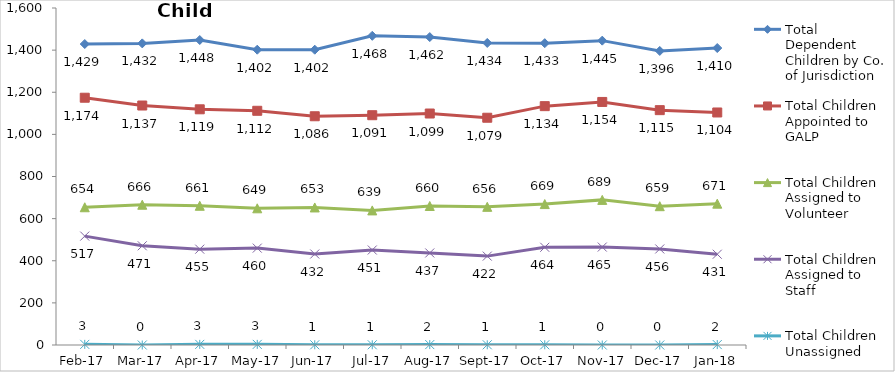
| Category | Total Dependent Children by Co. of Jurisdiction | Total Children Appointed to GALP | Total Children Assigned to Volunteer | Total Children Assigned to Staff | Total Children Unassigned |
|---|---|---|---|---|---|
| 2017-02-01 | 1429 | 1174 | 654 | 517 | 3 |
| 2017-03-01 | 1432 | 1137 | 666 | 471 | 0 |
| 2017-04-01 | 1448 | 1119 | 661 | 455 | 3 |
| 2017-05-01 | 1402 | 1112 | 649 | 460 | 3 |
| 2017-06-01 | 1402 | 1086 | 653 | 432 | 1 |
| 2017-07-01 | 1468 | 1091 | 639 | 451 | 1 |
| 2017-08-01 | 1462 | 1099 | 660 | 437 | 2 |
| 2017-09-01 | 1434 | 1079 | 656 | 422 | 1 |
| 2017-10-01 | 1433 | 1134 | 669 | 464 | 1 |
| 2017-11-01 | 1445 | 1154 | 689 | 465 | 0 |
| 2017-12-01 | 1396 | 1115 | 659 | 456 | 0 |
| 2018-01-01 | 1410 | 1104 | 671 | 431 | 2 |